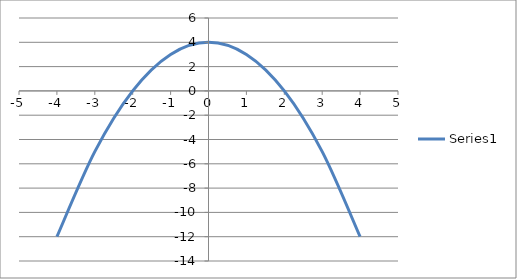
| Category | Series 0 |
|---|---|
| -4.0 | -12 |
| -3.0 | -5 |
| -2.0 | 0 |
| -1.0 | 3 |
| 0.0 | 4 |
| 1.0 | 3 |
| 2.0 | 0 |
| 3.0 | -5 |
| 4.0 | -12 |